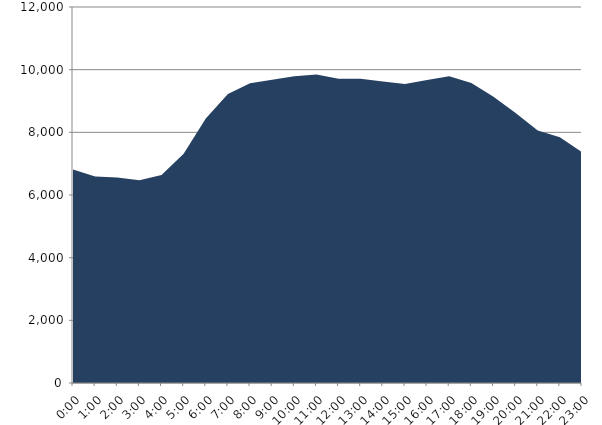
| Category | Series 0 | Series 1 |
|---|---|---|
| 2022-11-16 |  | 6809.857 |
| 2022-11-16 01:00:00 |  | 6588.729 |
| 2022-11-16 02:00:00 |  | 6562.219 |
| 2022-11-16 03:00:00 |  | 6467.313 |
| 2022-11-16 04:00:00 |  | 6636.995 |
| 2022-11-16 05:00:00 |  | 7312.756 |
| 2022-11-16 06:00:00 |  | 8443.014 |
| 2022-11-16 07:00:00 |  | 9220.649 |
| 2022-11-16 08:00:00 |  | 9564.158 |
| 2022-11-16 09:00:00 |  | 9675.149 |
| 2022-11-16 10:00:00 |  | 9789.332 |
| 2022-11-16 11:00:00 |  | 9845.228 |
| 2022-11-16 12:00:00 |  | 9706.26 |
| 2022-11-16 13:00:00 |  | 9712.658 |
| 2022-11-16 14:00:00 |  | 9619.974 |
| 2022-11-16 15:00:00 |  | 9543.012 |
| 2022-11-16 16:00:00 |  | 9672.208 |
| 2022-11-16 17:00:00 |  | 9788.439 |
| 2022-11-16 18:00:00 |  | 9571.46 |
| 2022-11-16 19:00:00 |  | 9133.84 |
| 2022-11-16 20:00:00 |  | 8613.797 |
| 2022-11-16 21:00:00 |  | 8058.733 |
| 2022-11-16 22:00:00 |  | 7840.636 |
| 2022-11-16 23:00:00 |  | 7365.27 |